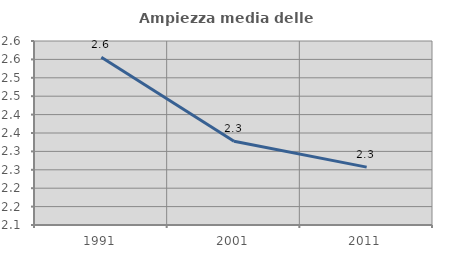
| Category | Ampiezza media delle famiglie |
|---|---|
| 1991.0 | 2.556 |
| 2001.0 | 2.328 |
| 2011.0 | 2.257 |